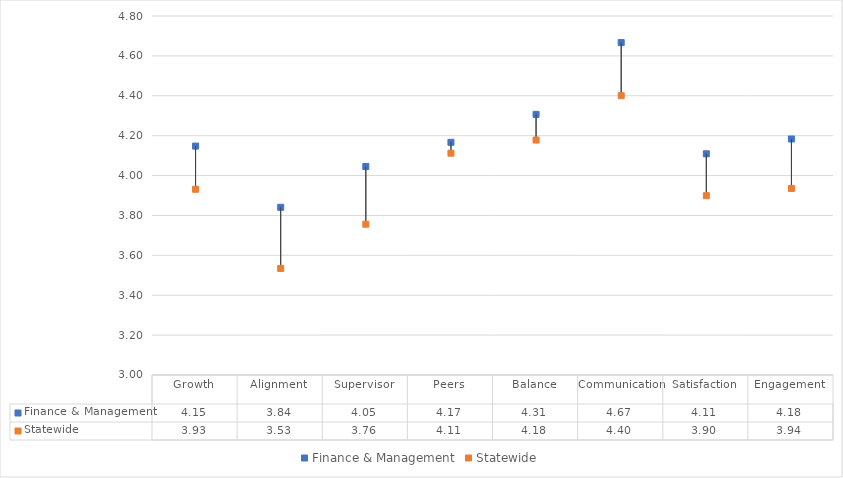
| Category | Finance & Management | Statewide |
|---|---|---|
| Growth | 4.148 | 3.931 |
| Alignment | 3.841 | 3.534 |
| Supervisor | 4.045 | 3.756 |
| Peers | 4.167 | 4.112 |
| Balance | 4.307 | 4.178 |
| Communication | 4.667 | 4.4 |
| Satisfaction | 4.109 | 3.899 |
| Engagement | 4.183 | 3.936 |